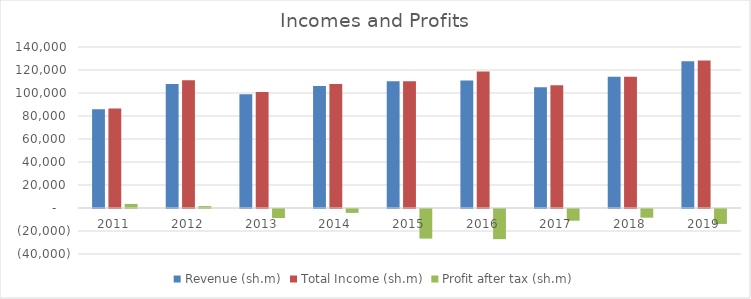
| Category | Revenue (sh.m) | Total Income (sh.m) | Profit after tax (sh.m) |
|---|---|---|---|
| 2011 | 85836 | 86590 | 3538 |
| 2012 | 107897 | 111138 | 1660 |
| 2013 | 98860 | 100883 | -7864 |
| 2014 | 106009 | 107804 | -3382 |
| 2015 | 110161 | 110314 | -25743 |
| 2016 | 110807 | 118780 | -26225 |
| 2017 | 105082 | 106651 | -10207 |
| 2018 | 114185 | 114230 | -7558 |
| 2019 | 127678 | 128347 | -12985 |